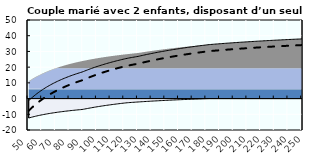
| Category | Coin fiscal moyen (somme des composantes) | Taux moyen d'imposition net en % du salaire brut |
|---|---|---|
| 50.0 | -1.323 | -7.757 |
| 51.0 | -0.509 | -6.891 |
| 52.0 | 0.275 | -6.058 |
| 53.0 | 1.029 | -5.256 |
| 54.0 | 1.755 | -4.484 |
| 55.0 | 2.454 | -3.74 |
| 56.0 | 3.129 | -3.023 |
| 57.0 | 3.78 | -2.33 |
| 58.0 | 4.408 | -1.662 |
| 59.0 | 5.015 | -1.017 |
| 60.0 | 5.602 | -0.392 |
| 61.0 | 6.17 | 0.211 |
| 62.0 | 6.719 | 0.796 |
| 63.0 | 7.251 | 1.361 |
| 64.0 | 7.766 | 1.909 |
| 65.0 | 8.265 | 2.44 |
| 66.0 | 8.75 | 2.955 |
| 67.0 | 9.22 | 3.455 |
| 68.0 | 9.676 | 3.94 |
| 69.0 | 10.118 | 4.411 |
| 70.0 | 10.548 | 4.868 |
| 71.0 | 10.966 | 5.313 |
| 72.0 | 11.373 | 5.745 |
| 73.0 | 11.768 | 6.165 |
| 74.0 | 12.153 | 6.574 |
| 75.0 | 12.527 | 6.973 |
| 76.0 | 12.892 | 7.36 |
| 77.0 | 13.247 | 7.738 |
| 78.0 | 13.592 | 8.106 |
| 79.0 | 13.93 | 8.464 |
| 80.0 | 14.258 | 8.814 |
| 81.0 | 14.579 | 9.155 |
| 82.0 | 14.892 | 9.487 |
| 83.0 | 15.197 | 9.812 |
| 84.0 | 15.495 | 10.129 |
| 85.0 | 15.786 | 10.438 |
| 86.0 | 16.07 | 10.741 |
| 87.0 | 16.348 | 11.036 |
| 88.0 | 16.619 | 11.324 |
| 89.0 | 16.884 | 11.607 |
| 90.0 | 17.202 | 11.944 |
| 91.0 | 17.554 | 12.319 |
| 92.0 | 17.899 | 12.685 |
| 93.0 | 18.236 | 13.044 |
| 94.0 | 18.566 | 13.395 |
| 95.0 | 18.889 | 13.738 |
| 96.0 | 19.205 | 14.075 |
| 97.0 | 19.515 | 14.404 |
| 98.0 | 19.818 | 14.727 |
| 99.0 | 20.116 | 15.043 |
| 100.0 | 20.407 | 15.353 |
| 101.0 | 20.693 | 15.657 |
| 102.0 | 20.973 | 15.954 |
| 103.0 | 21.247 | 16.246 |
| 104.0 | 21.517 | 16.533 |
| 105.0 | 21.781 | 16.814 |
| 106.0 | 22.04 | 17.089 |
| 107.0 | 22.294 | 17.36 |
| 108.0 | 22.544 | 17.625 |
| 109.0 | 22.789 | 17.886 |
| 110.0 | 23.03 | 18.142 |
| 111.0 | 23.266 | 18.393 |
| 112.0 | 23.498 | 18.64 |
| 113.0 | 23.726 | 18.882 |
| 114.0 | 23.95 | 19.121 |
| 115.0 | 24.17 | 19.355 |
| 116.0 | 24.386 | 19.585 |
| 117.0 | 24.599 | 19.811 |
| 118.0 | 24.807 | 20.033 |
| 119.0 | 25.013 | 20.251 |
| 120.0 | 25.215 | 20.466 |
| 121.0 | 25.414 | 20.677 |
| 122.0 | 25.606 | 20.882 |
| 123.0 | 25.769 | 21.055 |
| 124.0 | 25.929 | 21.226 |
| 125.0 | 26.087 | 21.393 |
| 126.0 | 26.242 | 21.558 |
| 127.0 | 26.395 | 21.721 |
| 128.0 | 26.545 | 21.881 |
| 129.0 | 26.693 | 22.038 |
| 130.0 | 26.839 | 22.193 |
| 131.0 | 27.039 | 22.406 |
| 132.0 | 27.237 | 22.616 |
| 133.0 | 27.432 | 22.823 |
| 134.0 | 27.623 | 23.027 |
| 135.0 | 27.812 | 23.228 |
| 136.0 | 27.999 | 23.427 |
| 137.0 | 28.182 | 23.622 |
| 138.0 | 28.363 | 23.814 |
| 139.0 | 28.541 | 24.003 |
| 140.0 | 28.717 | 24.19 |
| 141.0 | 28.89 | 24.374 |
| 142.0 | 29.061 | 24.556 |
| 143.0 | 29.229 | 24.735 |
| 144.0 | 29.395 | 24.912 |
| 145.0 | 29.559 | 25.086 |
| 146.0 | 29.72 | 25.258 |
| 147.0 | 29.88 | 25.427 |
| 148.0 | 30.037 | 25.594 |
| 149.0 | 30.192 | 25.759 |
| 150.0 | 30.345 | 25.922 |
| 151.0 | 30.496 | 26.082 |
| 152.0 | 30.645 | 26.241 |
| 153.0 | 30.792 | 26.397 |
| 154.0 | 30.937 | 26.551 |
| 155.0 | 31.08 | 26.704 |
| 156.0 | 31.221 | 26.854 |
| 157.0 | 31.361 | 27.002 |
| 158.0 | 31.499 | 27.149 |
| 159.0 | 31.635 | 27.294 |
| 160.0 | 31.769 | 27.437 |
| 161.0 | 31.902 | 27.578 |
| 162.0 | 32.033 | 27.717 |
| 163.0 | 32.162 | 27.855 |
| 164.0 | 32.29 | 27.991 |
| 165.0 | 32.417 | 28.125 |
| 166.0 | 32.541 | 28.258 |
| 167.0 | 32.665 | 28.389 |
| 168.0 | 32.787 | 28.519 |
| 169.0 | 32.907 | 28.647 |
| 170.0 | 33.026 | 28.773 |
| 171.0 | 33.144 | 28.898 |
| 172.0 | 33.26 | 29.022 |
| 173.0 | 33.375 | 29.144 |
| 174.0 | 33.488 | 29.265 |
| 175.0 | 33.601 | 29.384 |
| 176.0 | 33.712 | 29.502 |
| 177.0 | 33.821 | 29.619 |
| 178.0 | 33.93 | 29.734 |
| 179.0 | 34.037 | 29.849 |
| 180.0 | 34.143 | 29.961 |
| 181.0 | 34.248 | 30.073 |
| 182.0 | 34.351 | 30.183 |
| 183.0 | 34.424 | 30.26 |
| 184.0 | 34.497 | 30.337 |
| 185.0 | 34.568 | 30.413 |
| 186.0 | 34.639 | 30.488 |
| 187.0 | 34.709 | 30.563 |
| 188.0 | 34.778 | 30.636 |
| 189.0 | 34.847 | 30.709 |
| 190.0 | 34.914 | 30.781 |
| 191.0 | 34.981 | 30.853 |
| 192.0 | 35.048 | 30.923 |
| 193.0 | 35.113 | 30.993 |
| 194.0 | 35.178 | 31.062 |
| 195.0 | 35.243 | 31.131 |
| 196.0 | 35.306 | 31.198 |
| 197.0 | 35.369 | 31.265 |
| 198.0 | 35.432 | 31.332 |
| 199.0 | 35.493 | 31.397 |
| 200.0 | 35.555 | 31.462 |
| 201.0 | 35.615 | 31.527 |
| 202.0 | 35.675 | 31.59 |
| 203.0 | 35.734 | 31.653 |
| 204.0 | 35.793 | 31.716 |
| 205.0 | 35.851 | 31.778 |
| 206.0 | 35.909 | 31.839 |
| 207.0 | 35.966 | 31.9 |
| 208.0 | 36.022 | 31.96 |
| 209.0 | 36.078 | 32.019 |
| 210.0 | 36.134 | 32.078 |
| 211.0 | 36.189 | 32.137 |
| 212.0 | 36.243 | 32.195 |
| 213.0 | 36.297 | 32.252 |
| 214.0 | 36.35 | 32.309 |
| 215.0 | 36.403 | 32.365 |
| 216.0 | 36.456 | 32.421 |
| 217.0 | 36.508 | 32.476 |
| 218.0 | 36.559 | 32.531 |
| 219.0 | 36.61 | 32.585 |
| 220.0 | 36.66 | 32.638 |
| 221.0 | 36.711 | 32.692 |
| 222.0 | 36.76 | 32.744 |
| 223.0 | 36.809 | 32.797 |
| 224.0 | 36.858 | 32.848 |
| 225.0 | 36.906 | 32.9 |
| 226.0 | 36.954 | 32.951 |
| 227.0 | 37.002 | 33.001 |
| 228.0 | 37.049 | 33.051 |
| 229.0 | 37.095 | 33.101 |
| 230.0 | 37.141 | 33.15 |
| 231.0 | 37.187 | 33.198 |
| 232.0 | 37.233 | 33.247 |
| 233.0 | 37.278 | 33.295 |
| 234.0 | 37.322 | 33.342 |
| 235.0 | 37.366 | 33.389 |
| 236.0 | 37.41 | 33.436 |
| 237.0 | 37.454 | 33.482 |
| 238.0 | 37.497 | 33.528 |
| 239.0 | 37.54 | 33.573 |
| 240.0 | 37.582 | 33.619 |
| 241.0 | 37.624 | 33.663 |
| 242.0 | 37.666 | 33.708 |
| 243.0 | 37.707 | 33.752 |
| 244.0 | 37.748 | 33.795 |
| 245.0 | 37.789 | 33.839 |
| 246.0 | 37.829 | 33.882 |
| 247.0 | 37.869 | 33.924 |
| 248.0 | 37.909 | 33.966 |
| 249.0 | 37.949 | 34.008 |
| 250.0 | 37.988 | 34.05 |